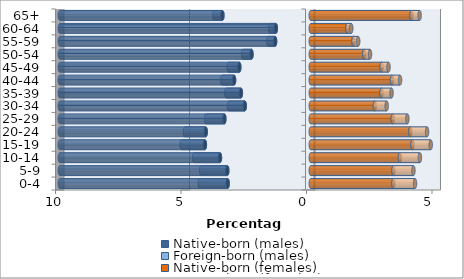
| Category | Native-born (males) | Foreign-born (males) | Native-born (females) | Foreign-born (females) |
|---|---|---|---|---|
| 0-4 | -3.311 | -1.11 | 3.292 | 0.863 |
| 5-9 | -3.326 | -1.037 | 3.297 | 0.795 |
| 10-14 | -3.617 | -1.028 | 3.554 | 0.795 |
| 15-19 | -4.218 | -0.926 | 4.053 | 0.727 |
| 20-24 | -4.184 | -0.834 | 3.971 | 0.664 |
| 25-29 | -3.442 | -0.727 | 3.268 | 0.582 |
| 30-34 | -2.628 | -0.63 | 2.555 | 0.47 |
| 35-39 | -2.783 | -0.582 | 2.822 | 0.398 |
| 40-44 | -3.054 | -0.48 | 3.238 | 0.32 |
| 45-49 | -2.846 | -0.427 | 2.822 | 0.276 |
| 50-54 | -2.361 | -0.335 | 2.133 | 0.228 |
| 55-59 | -1.42 | -0.271 | 1.702 | 0.189 |
| 60-64 | -1.391 | -0.228 | 1.459 | 0.155 |
| 65+ | -3.52 | -0.32 | 4.014 | 0.325 |